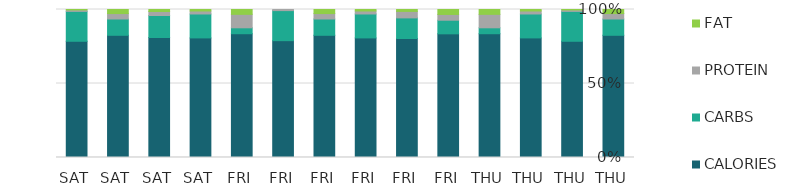
| Category | CALORIES | CARBS | PROTEIN | FAT |
|---|---|---|---|---|
| THU | 360 | 48 | 16 | 12 |
| THU | 105 | 27 | 1.3 | 0.4 |
| THU | 160 | 32 | 4 | 2 |
| THU | 230 | 11 | 25 | 9 |
| FRI | 1200 | 132 | 56 | 48 |
| FRI | 496 | 86 | 27 | 8 |
| FRI | 160 | 32 | 4 | 2 |
| FRI | 360 | 48 | 16 | 12 |
| FRI | 105 | 27 | 1 | 0 |
| FRI | 230 | 11 | 25 | 9 |
| SAT | 160 | 32 | 4 | 2 |
| SAT | 180 | 33 | 6 | 3 |
| SAT | 360 | 48 | 16 | 12 |
| SAT | 105 | 27 | 1.3 | 0.4 |